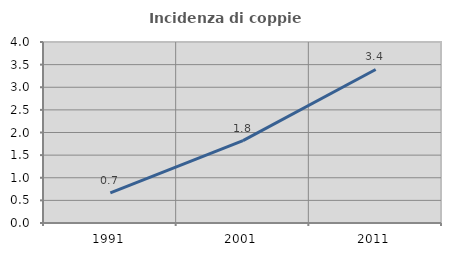
| Category | Incidenza di coppie miste |
|---|---|
| 1991.0 | 0.667 |
| 2001.0 | 1.821 |
| 2011.0 | 3.392 |